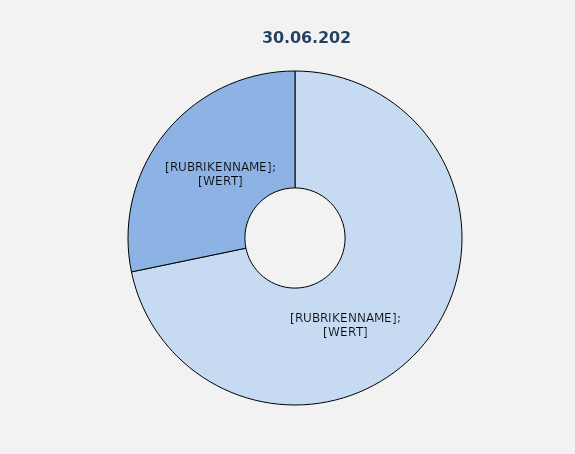
| Category | Series 1 |
|---|---|
| Vollzeitbeschäftigte | 71.748 |
| Teilzeitbeschäftigte | 28.252 |